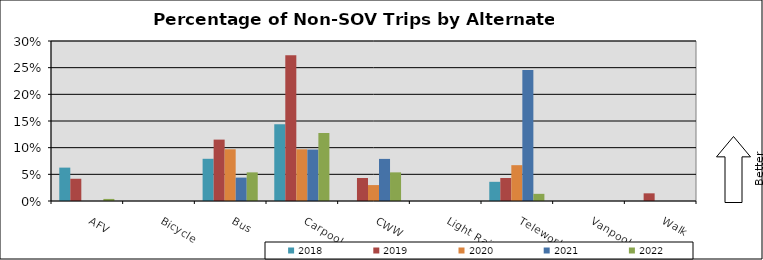
| Category | 2018 | 2019 | 2020 | 2021 | 2022 |
|---|---|---|---|---|---|
| AFV | 0.063 | 0.042 | 0 | 0 | 0.004 |
| Bicycle | 0 | 0 | 0 | 0 | 0 |
| Bus | 0.079 | 0.115 | 0.097 | 0.044 | 0.054 |
| Carpool | 0.144 | 0.273 | 0.097 | 0.096 | 0.128 |
| CWW | 0 | 0.043 | 0.03 | 0.079 | 0.054 |
| Light Rail | 0 | 0 | 0 | 0 | 0 |
| Telework | 0.036 | 0.043 | 0.067 | 0.246 | 0.013 |
| Vanpool | 0 | 0 | 0 | 0 | 0 |
| Walk | 0 | 0.014 | 0 | 0 | 0 |